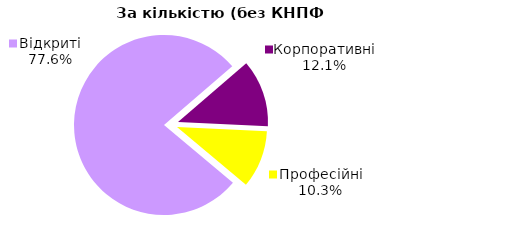
| Category | Series 0 |
|---|---|
| Відкриті | 45 |
| Корпоративні | 7 |
| Професійні | 6 |